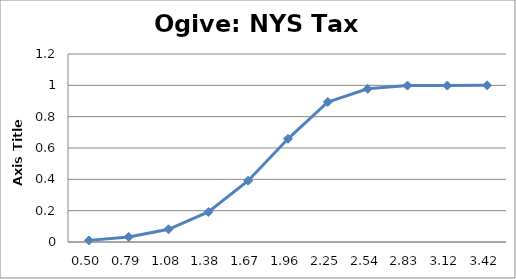
| Category | Series 0 |
|---|---|
| 0.5010805755333178 | 0.01 |
| 0.7925062599012933 | 0.032 |
| 1.0839319442692688 | 0.081 |
| 1.3753576286372442 | 0.192 |
| 1.6667833130052196 | 0.391 |
| 1.958208997373195 | 0.659 |
| 2.2496346817411705 | 0.894 |
| 2.541060366109146 | 0.978 |
| 2.8324860504771214 | 0.999 |
| 3.123911734845097 | 0.999 |
| 3.4153374192130728 | 1 |